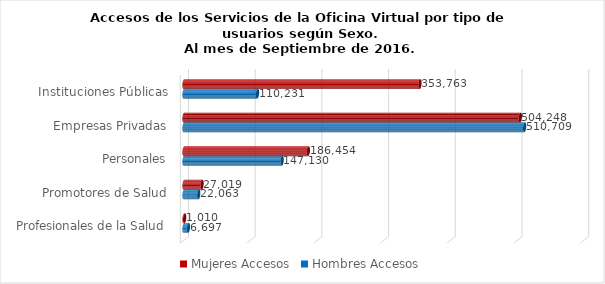
| Category | Mujeres | Hombres |
|---|---|---|
| Instituciones Públicas | 353763 | 110231 |
| Empresas Privadas | 504248 | 510709 |
| Personales | 186454 | 147130 |
| Promotores de Salud | 27019 | 22063 |
| Profesionales de la Salud | 1010 | 6697 |